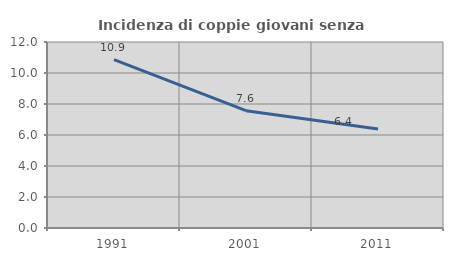
| Category | Incidenza di coppie giovani senza figli |
|---|---|
| 1991.0 | 10.86 |
| 2001.0 | 7.568 |
| 2011.0 | 6.389 |